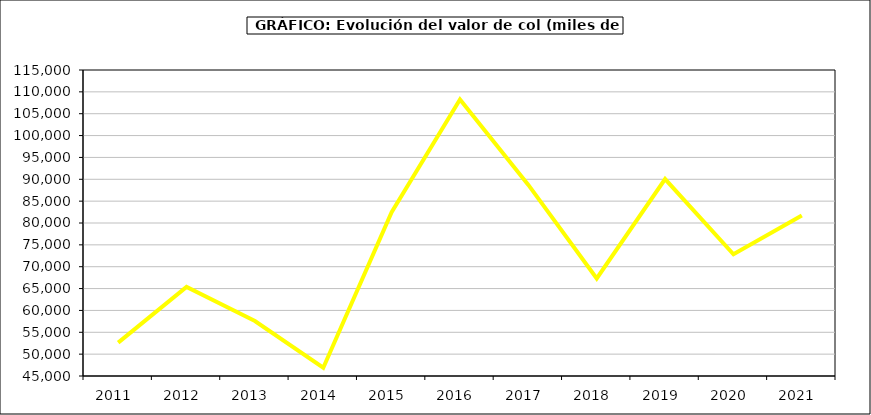
| Category | Valor |
|---|---|
| 2011.0 | 52642.369 |
| 2012.0 | 65369.978 |
| 2013.0 | 57574.735 |
| 2014.0 | 46884.616 |
| 2015.0 | 82468.9 |
| 2016.0 | 108241.9 |
| 2017.0 | 88707.96 |
| 2018.0 | 67321.637 |
| 2019.0 | 90049.076 |
| 2020.0 | 72831.571 |
| 2021.0 | 81730.267 |